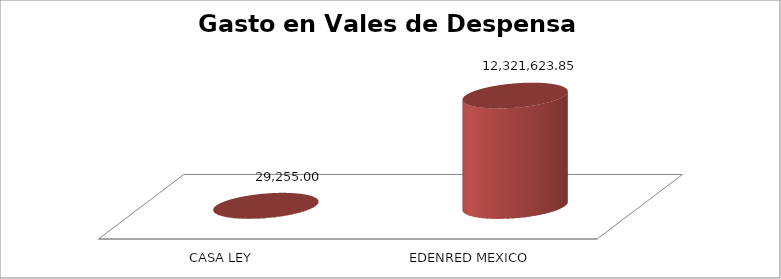
| Category | Suma |
|---|---|
| CASA LEY | 29255 |
| EDENRED MEXICO | 12321623.85 |